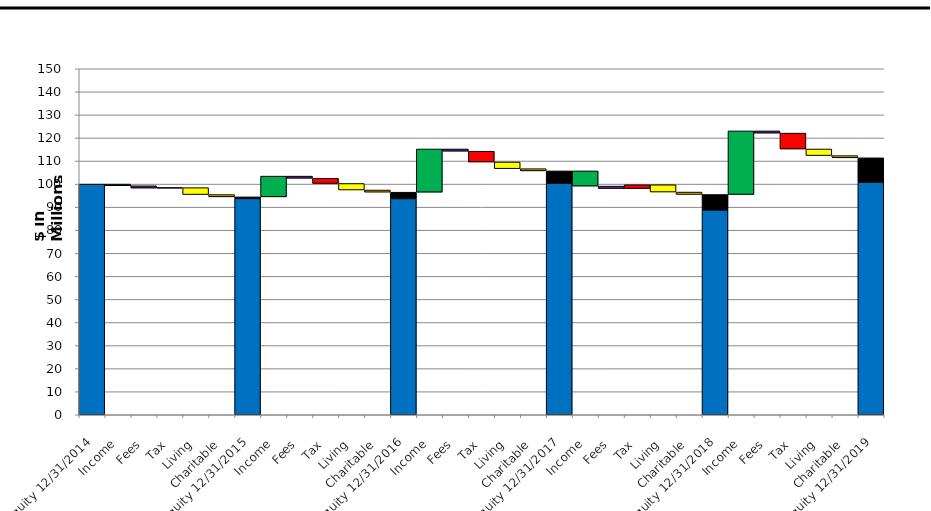
| Category | Series 0 | Series 1 |
|---|---|---|
| Equity 12/31/2014 | 0 | 100 |
| Income | 99.273 | 0.727 |
| Fees | 98.273 | 1 |
| Tax | 98.273 | 0.182 |
| Living | 95.455 | 3 |
| Charitable | 94.455 | 1 |
| Equity 12/31/2015 | 93.794 | 0.661 |
| Income | 94.455 | 9.006 |
| Fees | 102.517 | 0.945 |
| Tax | 100.265 | 2.252 |
| Living | 97.432 | 2.834 |
| Charitable | 96.487 | 0.945 |
| Equity 12/31/2016 | 93.771 | 2.716 |
| Income | 96.487 | 18.738 |
| Fees | 114.26 | 0.965 |
| Tax | 109.575 | 4.684 |
| Living | 106.681 | 2.895 |
| Charitable | 105.716 | 0.965 |
| Equity 12/31/2017 | 100.458 | 5.258 |
| Income | 99.122 | 6.594 |
| Fees | 98.065 | 1.057 |
| Tax | 98.065 | 1.648 |
| Living | 96.542 | 3.171 |
| Charitable | 95.485 | 1.057 |
| Equity 12/31/2018 | 88.831 | 6.654 |
| Income | 95.485 | 27.574 |
| Fees | 122.104 | 0.955 |
| Tax | 115.211 | 6.894 |
| Living | 112.346 | 2.865 |
| Charitable | 111.391 | 0.955 |
| Equity 12/31/2019 | 100.889 | 10.503 |